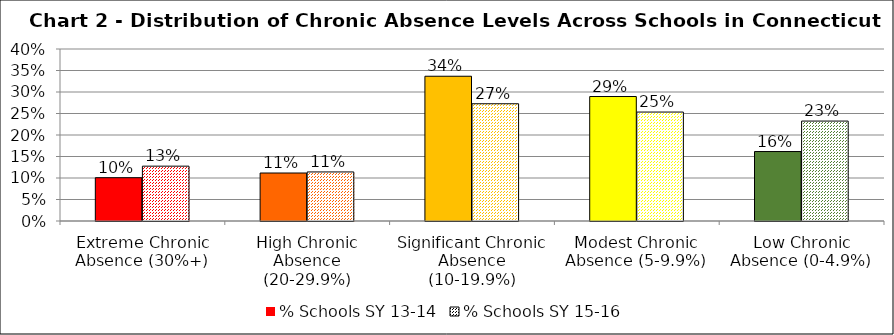
| Category | % Schools SY 13-14 | % Schools SY 15-16 |
|---|---|---|
| Extreme Chronic Absence (30%+) | 0.101 | 0.128 |
| High Chronic Absence (20-29.9%) | 0.112 | 0.114 |
| Significant Chronic Absence (10-19.9%) | 0.337 | 0.273 |
| Modest Chronic Absence (5-9.9%) | 0.289 | 0.253 |
| Low Chronic Absence (0-4.9%) | 0.162 | 0.232 |